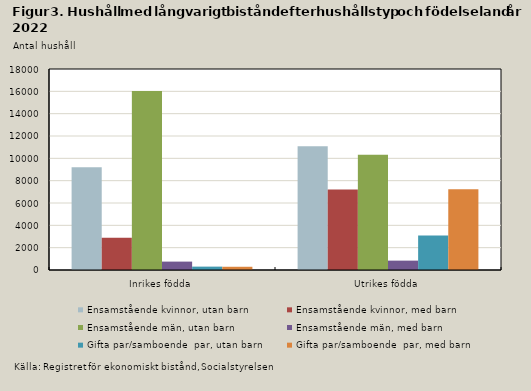
| Category | Ensamstående kvinnor, utan barn | Ensamstående kvinnor, med barn | Ensamstående män, utan barn | Ensamstående män, med barn | Gifta par/samboende  par, utan barn | Gifta par/samboende  par, med barn |
|---|---|---|---|---|---|---|
| Inrikes födda | 9208 | 2896 | 16036 | 752 | 303 | 290 |
| Utrikes födda | 11077 | 7218 | 10321 | 839 | 3099 | 7228 |